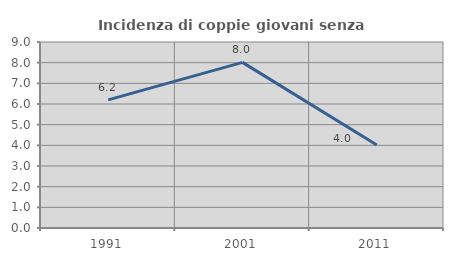
| Category | Incidenza di coppie giovani senza figli |
|---|---|
| 1991.0 | 6.202 |
| 2001.0 | 8.013 |
| 2011.0 | 4.013 |